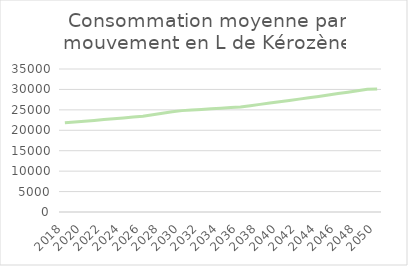
| Category | Consommation moyenne par mouvement en L de Kérozène |
|---|---|
| 2018.0 | 21825.397 |
| 2019.0 | 22021.825 |
| 2020.0 | 22220.022 |
| 2021.0 | 22420.002 |
| 2022.0 | 22621.782 |
| 2023.0 | 22825.378 |
| 2024.0 | 23030.806 |
| 2025.0 | 23238.084 |
| 2026.0 | 23447.226 |
| 2027.0 | 23798.935 |
| 2028.0 | 24155.919 |
| 2029.0 | 24518.258 |
| 2030.0 | 24812.477 |
| 2031.0 | 24961.352 |
| 2032.0 | 25111.12 |
| 2033.0 | 25261.786 |
| 2034.0 | 25413.357 |
| 2035.0 | 25565.837 |
| 2036.0 | 25719.232 |
| 2037.0 | 26027.863 |
| 2038.0 | 26340.198 |
| 2039.0 | 26656.28 |
| 2040.0 | 26976.155 |
| 2041.0 | 27299.869 |
| 2042.0 | 27627.468 |
| 2043.0 | 27958.997 |
| 2044.0 | 28294.505 |
| 2045.0 | 28634.039 |
| 2046.0 | 28977.648 |
| 2047.0 | 29325.379 |
| 2048.0 | 29677.284 |
| 2049.0 | 30033.411 |
| 2050.0 | 30116.413 |